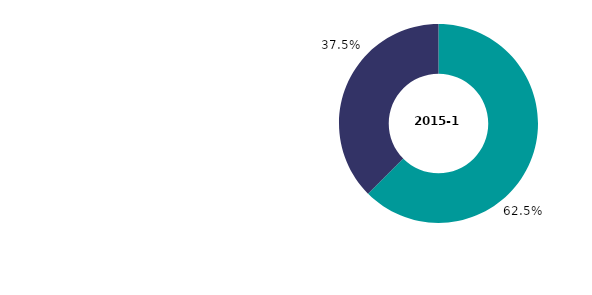
| Category | 2015-16 percentages |
|---|---|
| households without dependent children | 62.532 |
| households with dependent children | 37.468 |